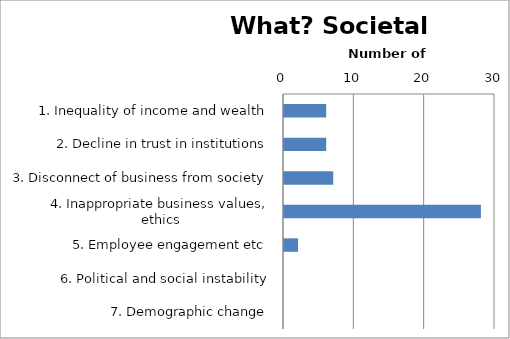
| Category | Series 0 |
|---|---|
| 1. Inequality of income and wealth | 6 |
| 2. Decline in trust in institutions | 6 |
| 3. Disconnect of business from society | 7 |
| 4. Inappropriate business values, ethics | 28 |
| 5. Employee engagement etc | 2 |
| 6. Political and social instability | 0 |
| 7. Demographic change | 0 |